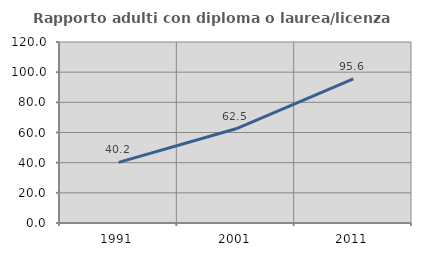
| Category | Rapporto adulti con diploma o laurea/licenza media  |
|---|---|
| 1991.0 | 40.215 |
| 2001.0 | 62.48 |
| 2011.0 | 95.581 |